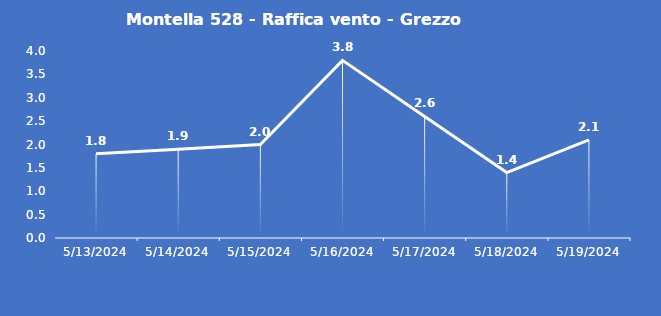
| Category | Montella 528 - Raffica vento - Grezzo (m/s) |
|---|---|
| 5/13/24 | 1.8 |
| 5/14/24 | 1.9 |
| 5/15/24 | 2 |
| 5/16/24 | 3.8 |
| 5/17/24 | 2.6 |
| 5/18/24 | 1.4 |
| 5/19/24 | 2.1 |